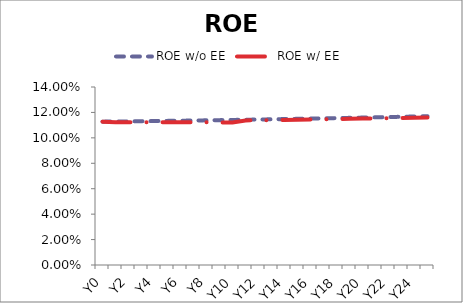
| Category | ROE w/o EE | ROE w/ EE |
|---|---|---|
| Y0 | 0.113 | 0.113 |
| Y1 | 0.113 | 0.112 |
| Y2 | 0.113 | 0.112 |
| Y3 | 0.113 | 0.112 |
| Y4 | 0.113 | 0.112 |
| Y5 | 0.113 | 0.112 |
| Y6 | 0.113 | 0.112 |
| Y7 | 0.114 | 0.112 |
| Y8 | 0.114 | 0.112 |
| Y9 | 0.114 | 0.112 |
| Y10 | 0.114 | 0.112 |
| Y11 | 0.114 | 0.114 |
| Y12 | 0.114 | 0.114 |
| Y13 | 0.115 | 0.114 |
| Y14 | 0.115 | 0.114 |
| Y15 | 0.115 | 0.114 |
| Y16 | 0.115 | 0.114 |
| Y17 | 0.115 | 0.115 |
| Y18 | 0.116 | 0.115 |
| Y19 | 0.116 | 0.115 |
| Y20 | 0.116 | 0.115 |
| Y21 | 0.116 | 0.115 |
| Y22 | 0.116 | 0.115 |
| Y23 | 0.117 | 0.116 |
| Y24 | 0.117 | 0.116 |
| Y25 | 0.117 | 0.116 |